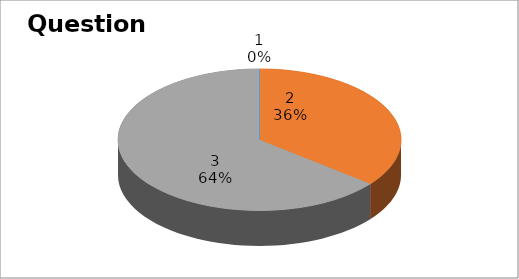
| Category | Series 0 |
|---|---|
| 0 | 0 |
| 1 | 5 |
| 2 | 9 |